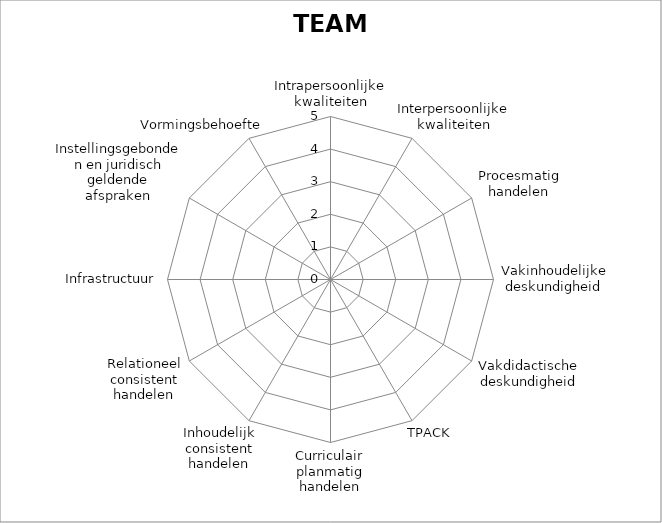
| Category | TEAM |
|---|---|
| Intrapersoonlijke kwaliteiten | 0 |
| Interpersoonlijke kwaliteiten | 0 |
| Procesmatig handelen | 0 |
| Vakinhoudelijke deskundigheid | 0 |
| Vakdidactische deskundigheid | 0 |
| TPACK | 0 |
| Curriculair planmatig handelen | 0 |
| Inhoudelijk consistent handelen | 0 |
| Relationeel consistent handelen | 0 |
| Infrastructuur | 0 |
| Instellingsgebonden en juridisch geldende afspraken | 0 |
| Vormingsbehoefte | 0 |